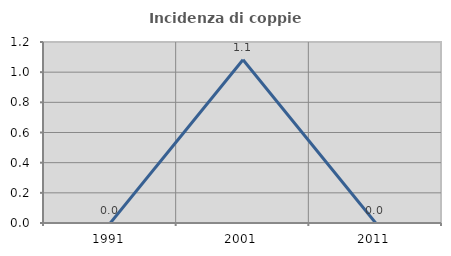
| Category | Incidenza di coppie miste |
|---|---|
| 1991.0 | 0 |
| 2001.0 | 1.082 |
| 2011.0 | 0 |